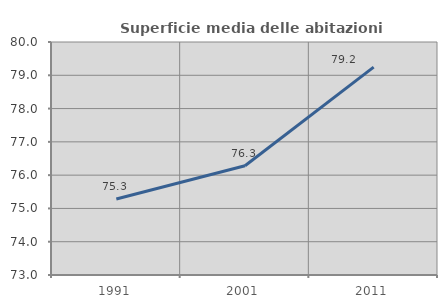
| Category | Superficie media delle abitazioni occupate |
|---|---|
| 1991.0 | 75.281 |
| 2001.0 | 76.281 |
| 2011.0 | 79.246 |